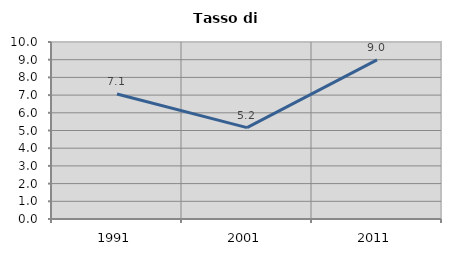
| Category | Tasso di disoccupazione   |
|---|---|
| 1991.0 | 7.059 |
| 2001.0 | 5.16 |
| 2011.0 | 8.989 |